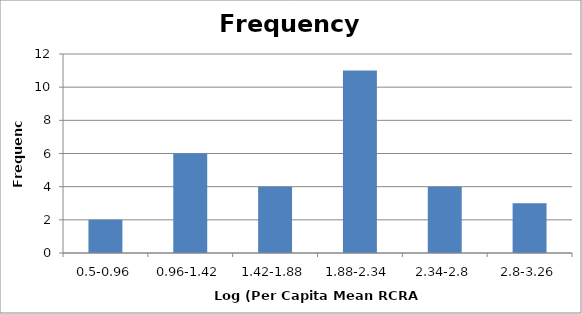
| Category | Series 0 |
|---|---|
| 0.5-0.96 | 2 |
| 0.96-1.42 | 6 |
| 1.42-1.88 | 4 |
| 1.88-2.34 | 11 |
| 2.34-2.8 | 4 |
| 2.8-3.26 | 3 |